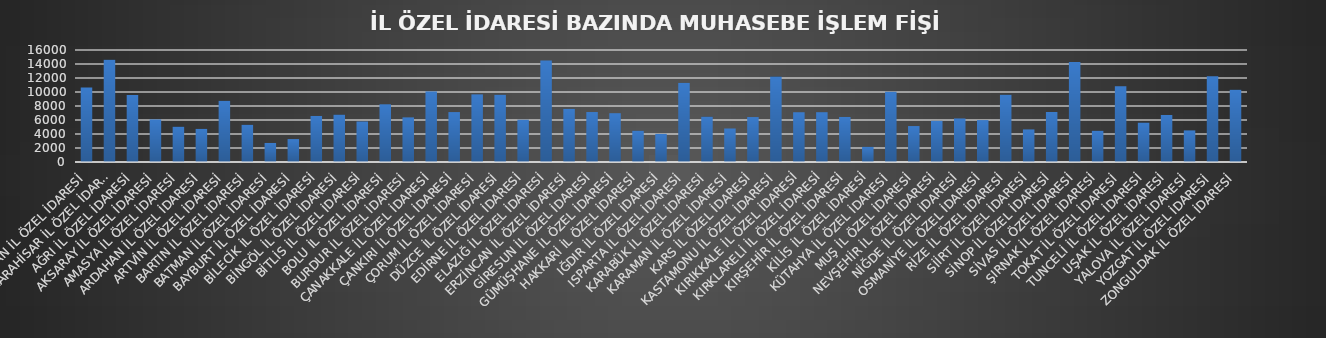
| Category | Series 0 |
|---|---|
| ADIYAMAN İL ÖZEL İDARESİ | 10643 |
| AFYONKARAHİSAR İL ÖZEL İDARESİ | 14615 |
| AĞRI İL ÖZEL İDARESİ | 9579 |
| AKSARAY İL ÖZEL İDARESİ | 6080 |
| AMASYA İL ÖZEL İDARESİ | 5041 |
| ARDAHAN İL ÖZEL İDARESİ | 4730 |
| ARTVİN İL ÖZEL İDARESİ | 8740 |
| BARTIN İL ÖZEL İDARESİ | 5315 |
| BATMAN İL ÖZEL İDARESİ | 2719 |
| BAYBURT İL ÖZEL İDARESİ | 3274 |
| BİLECİK İL ÖZEL İDARESİ | 6576 |
| BİNGÖL İL ÖZEL İDARESİ | 6766 |
| BİTLİS İL ÖZEL İDARESİ | 5787 |
| BOLU İL ÖZEL İDARESİ | 8241 |
| BURDUR İL ÖZEL İDARESİ | 6374 |
| ÇANAKKALE İL ÖZEL İDARESİ | 10082 |
| ÇANKIRI İL ÖZEL İDARESİ | 7131 |
| ÇORUM İL ÖZEL İDARESİ | 9658 |
| DÜZCE İL ÖZEL İDARESİ | 9608 |
| EDİRNE İL ÖZEL İDARESİ | 6034 |
| ELAZIĞ İL ÖZEL İDARESİ | 14506 |
| ERZİNCAN İL ÖZEL İDARESİ | 7591 |
| GİRESUN İL ÖZEL İDARESİ | 7137 |
| GÜMÜŞHANE İL ÖZEL İDARESİ | 6971 |
| HAKKARİ İL ÖZEL İDARESİ | 4469 |
| IĞDIR İL ÖZEL İDARESİ | 4016 |
| ISPARTA İL ÖZEL İDARESİ | 11307 |
| KARABÜK İL ÖZEL İDARESİ | 6479 |
| KARAMAN İL ÖZEL İDARESİ | 4786 |
| KARS İL ÖZEL İDARESİ | 6420 |
| KASTAMONU İL ÖZEL İDARESİ | 12199 |
| KIRIKKALE İL ÖZEL İDARESİ | 7107 |
| KIRKLARELİ İL ÖZEL İDARESİ | 7114 |
| KIRŞEHİR İL ÖZEL İDARESİ | 6434 |
| KİLİS İL ÖZEL İDARESİ | 2167 |
| KÜTAHYA İL ÖZEL İDARESİ | 10034 |
| MUŞ İL ÖZEL İDARESİ | 5134 |
| NEVŞEHİR İL ÖZEL İDARESİ | 5880 |
| NİĞDE İL ÖZEL İDARESİ | 6219 |
| OSMANİYE İL ÖZEL İDARESİ | 5989 |
| RİZE İL ÖZEL İDARESİ | 9603 |
| SİİRT İL ÖZEL İDARESİ | 4654 |
| SİNOP İL ÖZEL İDARESİ | 7140 |
| SİVAS İL ÖZEL İDARESİ | 14297 |
| ŞIRNAK İL ÖZEL İDARESİ | 4463 |
| TOKAT İL ÖZEL İDARESİ | 10835 |
| TUNCELİ İL ÖZEL İDARESİ | 5630 |
| UŞAK İL ÖZEL İDARESİ | 6711 |
| YALOVA İL ÖZEL İDARESİ | 4512 |
| YOZGAT İL ÖZEL İDARESİ | 12236 |
| ZONGULDAK İL ÖZEL İDARESİ | 10316 |